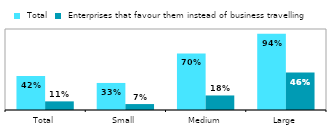
| Category |  Total |  Enterprises that favour them instead of business travelling |
|---|---|---|
| Total | 0.42 | 0.107 |
| Small | 0.334 | 0.073 |
| Medium | 0.699 | 0.18 |
| Large | 0.942 | 0.462 |